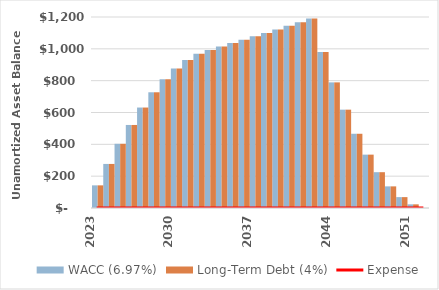
| Category | WACC (6.97%) | Long-Term Debt (4%) |
|---|---|---|
| 2023.0 | 142.26 | 142.26 |
| 2024.0 | 276.856 | 276.856 |
| 2025.0 | 403.449 | 403.449 |
| 2026.0 | 521.685 | 521.685 |
| 2027.0 | 631.19 | 631.19 |
| 2028.0 | 727.057 | 727.057 |
| 2029.0 | 809.013 | 809.013 |
| 2030.0 | 876.78 | 876.78 |
| 2031.0 | 930.075 | 930.075 |
| 2032.0 | 968.607 | 968.607 |
| 2033.0 | 992.082 | 992.082 |
| 2034.0 | 1014.424 | 1014.424 |
| 2035.0 | 1035.983 | 1035.983 |
| 2036.0 | 1057.133 | 1057.133 |
| 2037.0 | 1078.276 | 1078.276 |
| 2038.0 | 1099.841 | 1099.841 |
| 2039.0 | 1121.838 | 1121.838 |
| 2040.0 | 1144.275 | 1144.275 |
| 2041.0 | 1167.161 | 1167.161 |
| 2042.0 | 1190.504 | 1190.504 |
| 2043.0 | 980.289 | 980.289 |
| 2044.0 | 789.272 | 789.272 |
| 2045.0 | 617.837 | 617.837 |
| 2046.0 | 466.376 | 466.376 |
| 2047.0 | 335.288 | 335.288 |
| 2048.0 | 224.982 | 224.982 |
| 2049.0 | 135.871 | 135.871 |
| 2050.0 | 68.381 | 68.381 |
| 2051.0 | 22.944 | 22.944 |
| 2052.0 | 0 | 0 |